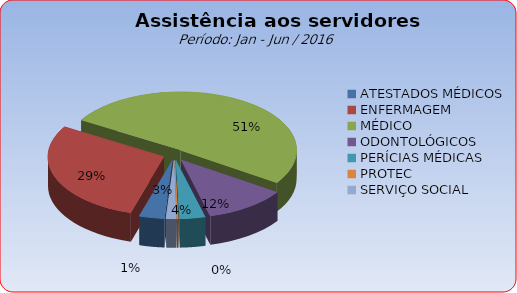
| Category | Series 0 |
|---|---|
| ATESTADOS MÉDICOS | 3.497 |
| ENFERMAGEM | 29.016 |
| MÉDICO | 50.796 |
| ODONTOLÓGICOS | 11.529 |
| PERÍCIAS MÉDICAS | 3.546 |
| PROTEC | 0.193 |
| SERVIÇO SOCIAL | 1.423 |